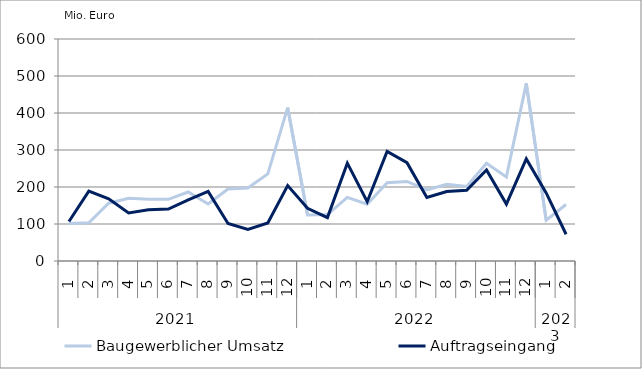
| Category | Baugewerblicher Umsatz | Auftragseingang |
|---|---|---|
| 0 | 101295.895 | 106850.127 |
| 1 | 103236.543 | 188883.434 |
| 2 | 156172.725 | 168204.42 |
| 3 | 169257.088 | 130052.073 |
| 4 | 166897.821 | 138492.214 |
| 5 | 166720.216 | 140262.426 |
| 6 | 186515.191 | 165331.191 |
| 7 | 154188.941 | 188169.655 |
| 8 | 194464.12 | 101359.538 |
| 9 | 197281.201 | 85626.862 |
| 10 | 235325.083 | 102880.924 |
| 11 | 414469.471 | 203900.676 |
| 12 | 124217.549 | 142351.759 |
| 13 | 125619.696 | 117194.423 |
| 14 | 171896.664 | 264509.013 |
| 15 | 153384.654 | 160146.519 |
| 16 | 211335.38 | 295997.826 |
| 17 | 214914.164 | 265813.917 |
| 18 | 192047.613 | 171529.517 |
| 19 | 207577.681 | 187809.656 |
| 20 | 201109.781 | 190941.096 |
| 21 | 264135.048 | 246250.021 |
| 22 | 227299.047 | 153783.993 |
| 23 | 480026.589 | 276019.328 |
| 24 | 110408.991 | 184068.731 |
| 25 | 152702.87 | 72330.186 |